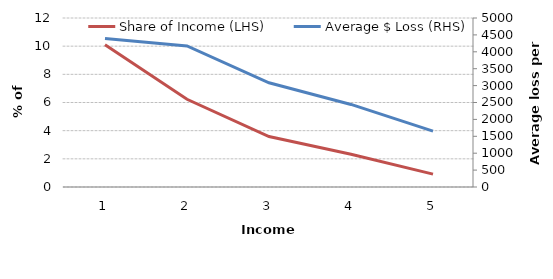
| Category | Share of Income (LHS) |
|---|---|
| 0 | 10.097 |
| 1 | 6.23 |
| 2 | 3.581 |
| 3 | 2.325 |
| 4 | 0.913 |